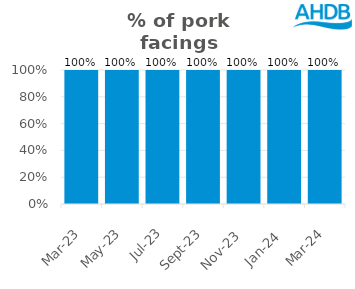
| Category | Pork |
|---|---|
| 2023-03-01 | 1 |
| 2023-05-01 | 1 |
| 2023-07-01 | 1 |
| 2023-09-01 | 1 |
| 2023-11-01 | 1 |
| 2024-01-01 | 1 |
| 2024-03-01 | 1 |